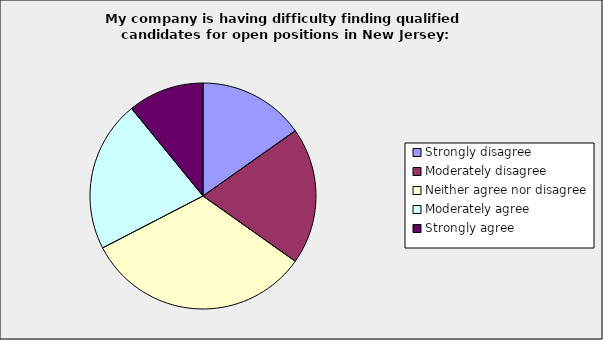
| Category | Series 0 |
|---|---|
| Strongly disagree | 0.152 |
| Moderately disagree | 0.196 |
| Neither agree nor disagree | 0.326 |
| Moderately agree | 0.217 |
| Strongly agree | 0.109 |